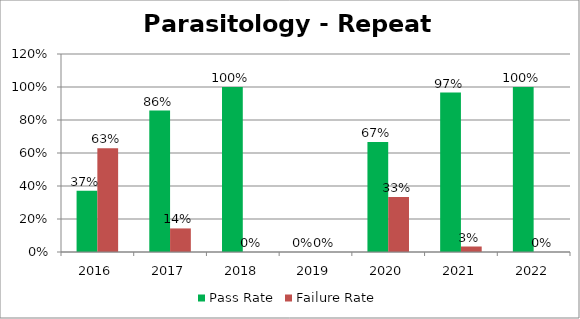
| Category | Pass Rate | Failure Rate |
|---|---|---|
| 2016.0 | 0.371 | 0.629 |
| 2017.0 | 0.857 | 0.143 |
| 2018.0 | 1 | 0 |
| 2019.0 | 0 | 0 |
| 2020.0 | 0.667 | 0.333 |
| 2021.0 | 0.967 | 0.033 |
| 2022.0 | 1 | 0 |